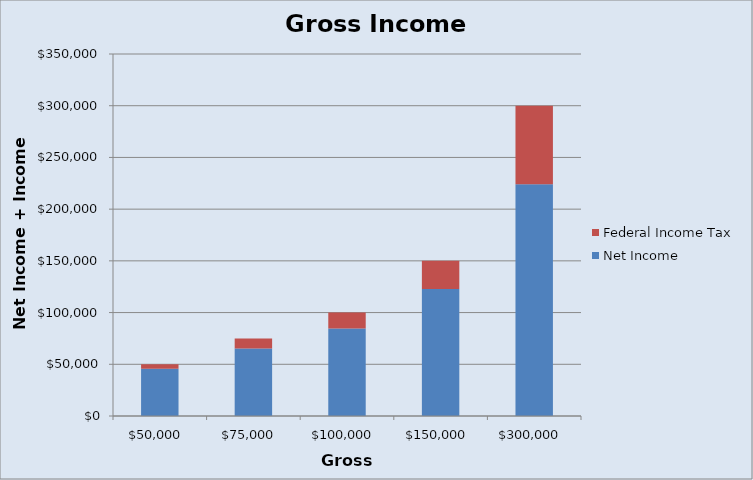
| Category | Net Income | Federal Income Tax |
|---|---|---|
| 50000.0 | 45634 | 4366 |
| 75000.0 | 65281.5 | 9718.5 |
| 100000.0 | 84705.5 | 15294.5 |
| 150000.0 | 122705.5 | 27294.5 |
| 300000.0 | 224006.5 | 75993.5 |